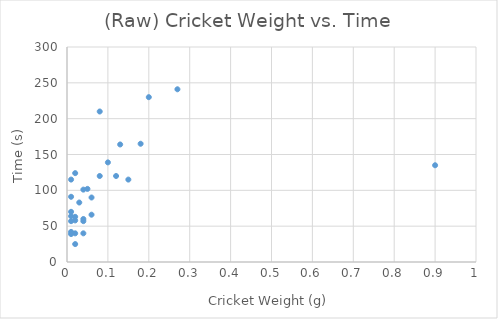
| Category | Time (s) |
|---|---|
| 0.15 | 115 |
| 0.2 | 230 |
| 0.08 | 120 |
| 0.06 | 90 |
| 0.06 | 66 |
| 0.01 | 64 |
| 0.12 | 120 |
| 0.9 | 135 |
| 0.04 | 60 |
| 0.27 | 241 |
| 0.18 | 165 |
| 0.13 | 164 |
| 0.1 | 139 |
| 0.08 | 210 |
| 0.05 | 102 |
| 0.02 | 58 |
| 0.04 | 40 |
| 0.01 | 39 |
| 0.01 | 115 |
| 0.01 | 42 |
| 0.02 | 63 |
| 0.02 | 25 |
| 0.01 | 70 |
| 0.02 | 40 |
| 0.04 | 57 |
| 0.02 | 124 |
| 0.01 | 91 |
| 0.04 | 101 |
| 0.03 | 83 |
| 0.01 | 57 |